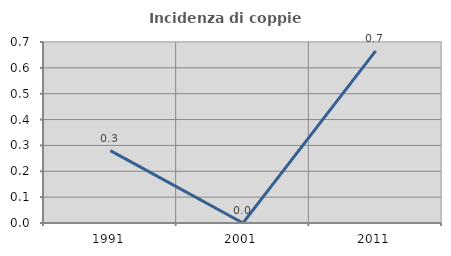
| Category | Incidenza di coppie miste |
|---|---|
| 1991.0 | 0.28 |
| 2001.0 | 0 |
| 2011.0 | 0.666 |